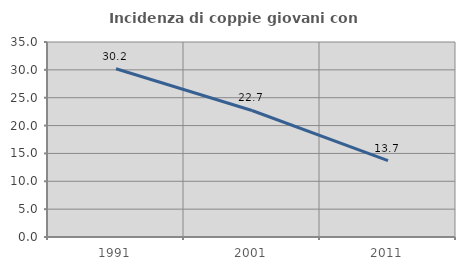
| Category | Incidenza di coppie giovani con figli |
|---|---|
| 1991.0 | 30.19 |
| 2001.0 | 22.708 |
| 2011.0 | 13.693 |